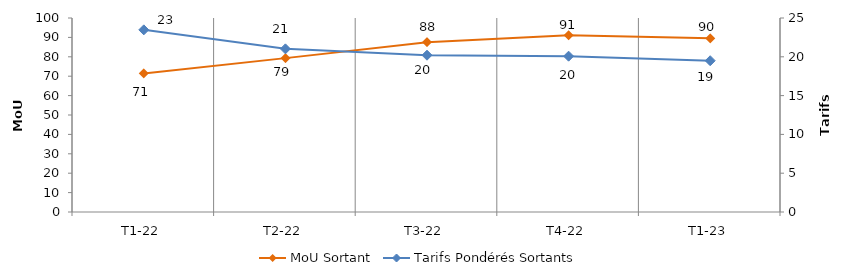
| Category | MoU Sortant |
|---|---|
| T1-22 | 71.427 |
| T2-22 | 79.316 |
| T3-22 | 87.52 |
| T4-22 | 91.091 |
| T1-23 | 89.502 |